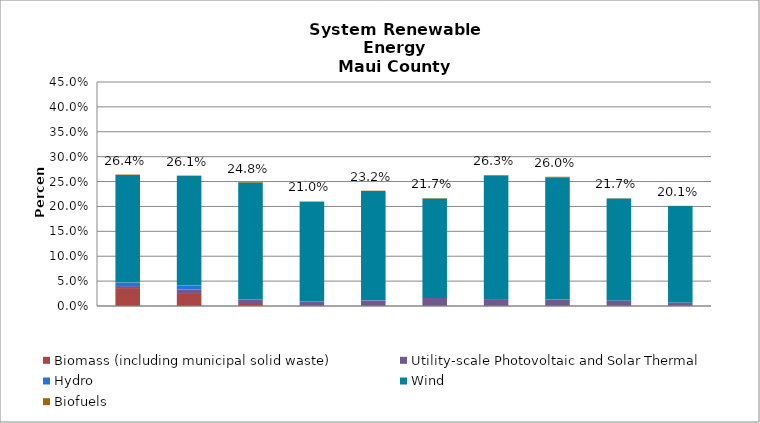
| Category | Biomass (including municipal solid waste) | Utility-scale Photovoltaic and Solar Thermal | Hydro | Wind | Biofuels |
|---|---|---|---|---|---|
| 2014.0 | 0.036 | 0.004 | 0.007 | 0.216 | 0.001 |
| 2015.0 | 0.026 | 0.007 | 0.008 | 0.22 | 0.001 |
| 2016.0 | 0.004 | 0.008 | 0.001 | 0.235 | 0.001 |
| 2017.0 | 0 | 0.008 | 0.001 | 0.2 | 0.001 |
| 2018.0 | 0 | 0.011 | 0 | 0.219 | 0.001 |
| 2019.0 | 0 | 0.016 | 0 | 0.2 | 0.001 |
| 2020.0 | 0 | 0.014 | 0 | 0.248 | 0.001 |
| 2021.0 | 0 | 0.013 | 0 | 0.246 | 0.001 |
| 2022.0 | 0 | 0.011 | 0 | 0.205 | 0 |
| 2023.0 | 0 | 0.007 | 0 | 0.194 | 0 |